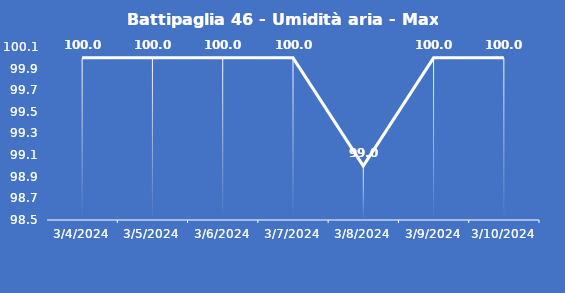
| Category | Battipaglia 46 - Umidità aria - Max (%) |
|---|---|
| 3/4/24 | 100 |
| 3/5/24 | 100 |
| 3/6/24 | 100 |
| 3/7/24 | 100 |
| 3/8/24 | 99 |
| 3/9/24 | 100 |
| 3/10/24 | 100 |